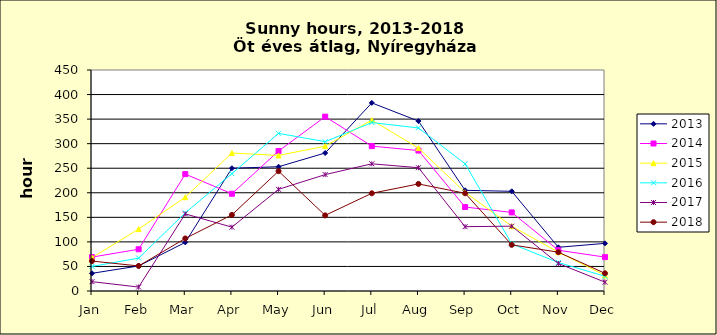
| Category | 2013 | 2014 | 2015 | 2016 | 2017 | 2018 |
|---|---|---|---|---|---|---|
| Jan | 36 | 69 | 68 | 50 | 19 | 61 |
| Feb | 51 | 85 | 126 | 67 | 8 | 51 |
| Mar | 99 | 238 | 191 | 159 | 157 | 107 |
| Apr | 250 | 198 | 281 | 239 | 130 | 155 |
| May | 253 | 285 | 276 | 321 | 207 | 244 |
| Jun | 281 | 355 | 295 | 304 | 237 | 154 |
| Jul | 383 | 295 | 348 | 343 | 259 | 199 |
| Aug | 346 | 286 | 291 | 332 | 251 | 218 |
| Sep | 205 | 171 | 201 | 259 | 131 | 199 |
| Oct | 203 | 160 | 132 | 96 | 132 | 94 |
| Nov | 89 | 83 | 79 | 58 | 56 | 79 |
| Dec | 97 | 69 | 32 | 30 | 18 | 36 |